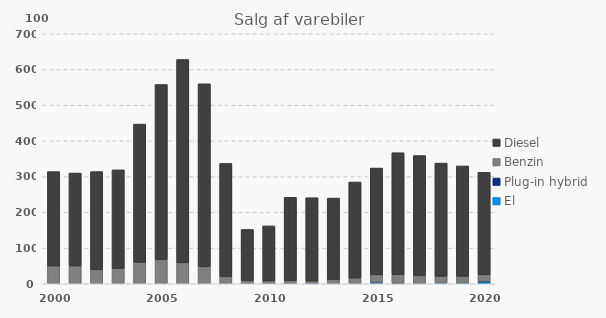
| Category | El | Plug-in hybrid | Benzin | Diesel |
|---|---|---|---|---|
| 2000 | 0 | 0 | 50 | 264 |
| 2001 | 0 | 0 | 50 | 260 |
| 2002 | 0 | 0 | 39 | 275 |
| 2003 | 0 | 0 | 43 | 276 |
| 2004 | 0 | 0 | 60 | 387 |
| 2005 | 0 | 0 | 68 | 490 |
| 2006 | 0 | 0 | 59 | 569 |
| 2007 | 0 | 0 | 48 | 512 |
| 2008 | 0 | 0 | 20 | 317 |
| 2009 | 0 | 0 | 9 | 143 |
| 2010 | 0 | 0 | 8 | 154 |
| 2011 | 0 | 0 | 9 | 233 |
| 2012 | 1 | 0 | 7 | 233 |
| 2013 | 1 | 0 | 11 | 228 |
| 2014 | 1 | 0 | 15 | 269 |
| 2015 | 3 | 1 | 21 | 299 |
| 2016 | 1 | 1 | 24 | 341 |
| 2017 | 1 | 0 | 22 | 336 |
| 2018 | 2 | 0 | 19 | 317 |
| 2019 | 2 | 0 | 19 | 309 |
| 2020 | 5 | 2 | 18 | 287 |